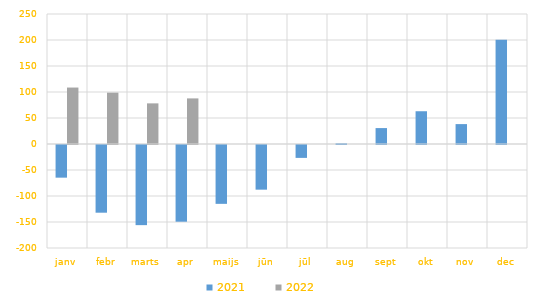
| Category | 2021 | 2022 |
|---|---|---|
| janv | -62808.075 | 108554.179 |
| febr | -130183.513 | 98735.641 |
| marts | -154114.179 | 78145.563 |
| apr | -147503.301 | 87696.664 |
| maijs | -113180.114 | 0 |
| jūn | -85892.075 | 0 |
| jūl | -24790.077 | 0 |
| aug | 1407.353 | 0 |
| sept | 30609.788 | 0 |
| okt | 63006.825 | 0 |
| nov | 38267.962 | 0 |
| dec | 200524.486 | 0 |